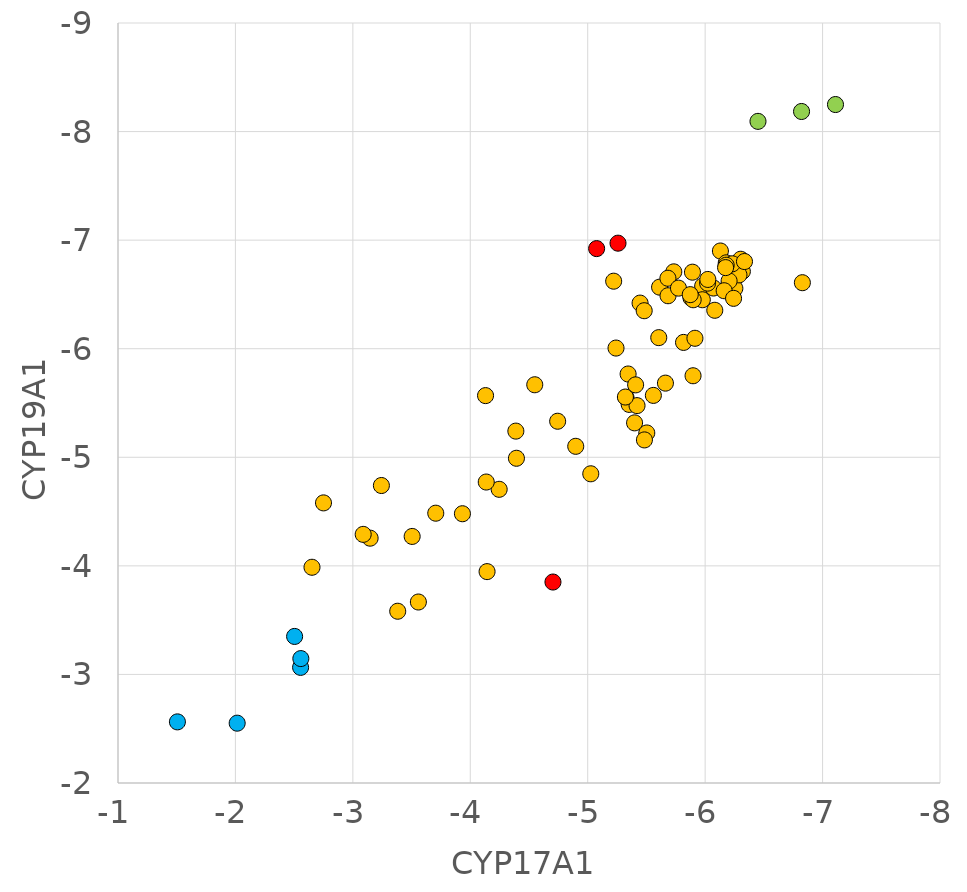
| Category | CYP19A1 3S79 |
|---|---|
| -7.11 | -8.249 |
| -6.821 | -8.185 |
| -6.45 | -8.094 |
| -5.446 | -6.42 |
| -6.828 | -6.608 |
| -6.13 | -6.9 |
| -5.979 | -6.578 |
| -6.303 | -6.824 |
| -5.816 | -6.058 |
| -5.605 | -6.102 |
| -6.2 | -6.581 |
| -6.18 | -6.791 |
| -6.317 | -6.712 |
| -5.897 | -5.751 |
| -6.202 | -6.579 |
| -6.071 | -6.559 |
| -6.253 | -6.556 |
| -5.258 | -6.972 |
| -5.612 | -6.567 |
| -6.288 | -6.68 |
| -6.204 | -6.624 |
| -6.231 | -6.782 |
| -5.892 | -6.705 |
| -5.913 | -6.096 |
| -5.733 | -6.708 |
| -5.976 | -6.451 |
| -5.88 | -6.467 |
| -5.399 | -5.317 |
| -6.179 | -6.769 |
| -6.162 | -6.534 |
| -5.326 | -5.551 |
| -5.241 | -6.006 |
| -5.559 | -5.57 |
| -4.744 | -5.332 |
| -6.021 | -6.604 |
| -6.023 | -6.638 |
| -5.684 | -6.488 |
| -5.221 | -6.622 |
| -6.335 | -6.803 |
| -5.898 | -6.451 |
| -5.026 | -4.848 |
| -5.353 | -5.487 |
| -4.549 | -5.668 |
| -6.174 | -6.747 |
| -5.344 | -5.767 |
| -5.683 | -6.649 |
| -5.503 | -5.224 |
| -5.481 | -6.35 |
| -5.773 | -6.558 |
| -5.662 | -5.683 |
| -6.242 | -6.464 |
| -5.873 | -6.498 |
| -5.076 | -6.922 |
| -2.504 | -3.35 |
| -5.42 | -5.476 |
| -6.082 | -6.354 |
| -5.483 | -5.16 |
| -4.898 | -5.101 |
| -4.704 | -3.851 |
| -3.243 | -4.74 |
| -3.505 | -4.271 |
| -2.555 | -3.065 |
| -5.321 | -5.555 |
| -3.147 | -4.255 |
| -2.652 | -3.987 |
| -4.246 | -4.705 |
| -5.408 | -5.667 |
| -4.136 | -4.772 |
| -4.13 | -5.568 |
| -4.393 | -4.991 |
| -4.388 | -5.241 |
| -1.506 | -2.563 |
| -2.557 | -3.146 |
| -3.933 | -4.48 |
| -2.015 | -2.551 |
| -3.088 | -4.29 |
| -2.75 | -4.58 |
| -3.706 | -4.485 |
| -4.143 | -3.947 |
| -3.558 | -3.667 |
| -3.382 | -3.582 |